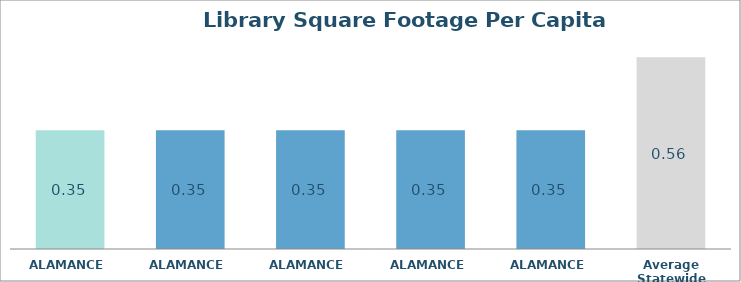
| Category | Series 0 |
|---|---|
| ALAMANCE  | 0.346 |
| ALAMANCE  | 0.346 |
| ALAMANCE  | 0.346 |
| ALAMANCE  | 0.346 |
| ALAMANCE  | 0.346 |
| Average Statewide | 0.559 |